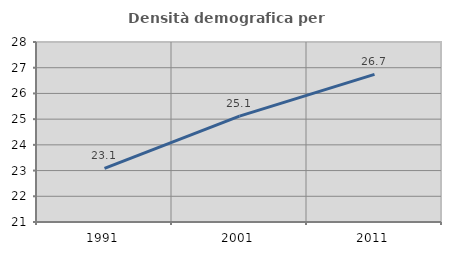
| Category | Densità demografica |
|---|---|
| 1991.0 | 23.081 |
| 2001.0 | 25.12 |
| 2011.0 | 26.739 |